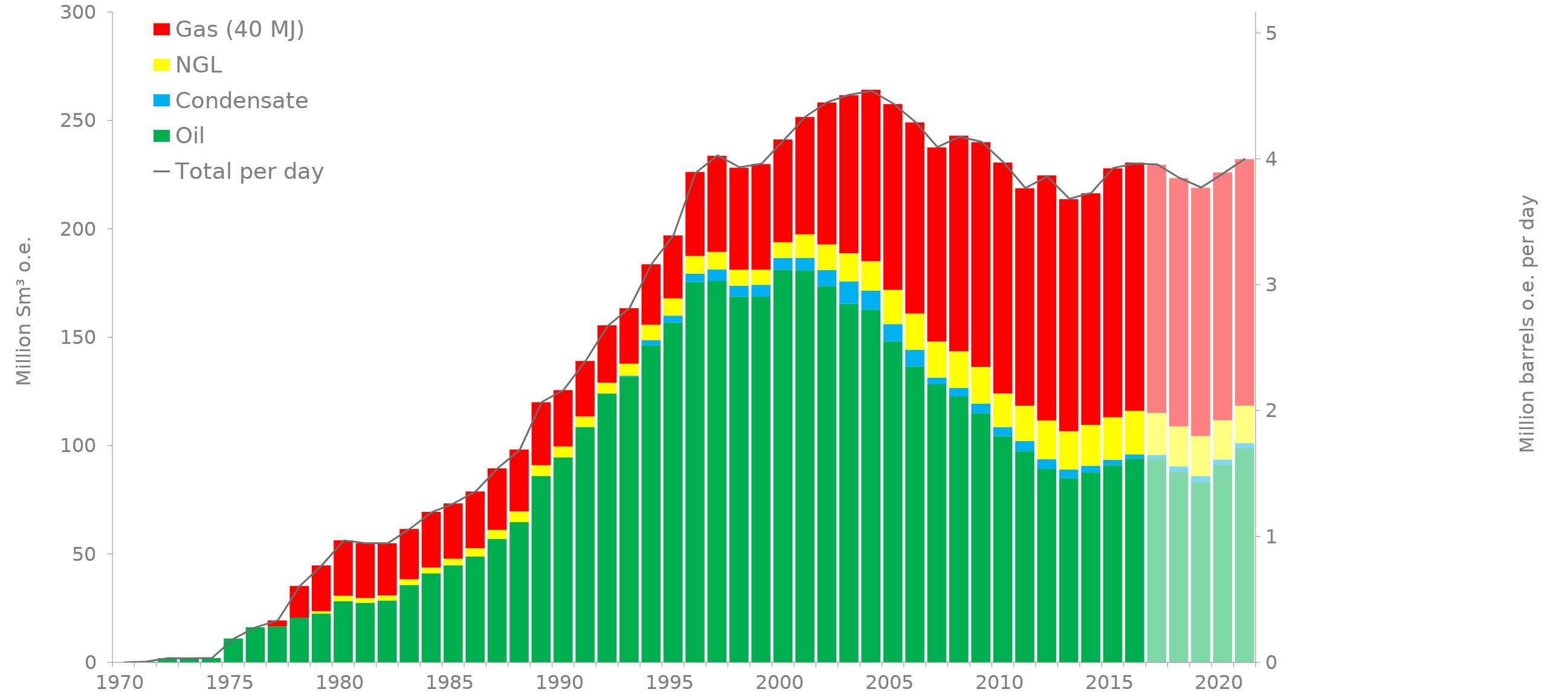
| Category | Oil | Condensate | NGL | Gas (40 MJ) |
|---|---|---|---|---|
| 1970.0 | 0 | 0 | 0 | 0 |
| 1971.0 | 0.36 | 0 | 0 | 0 |
| 1972.0 | 1.93 | 0 | 0 | 0 |
| 1973.0 | 1.87 | 0 | 0 | 0 |
| 1974.0 | 2.01 | 0 | 0 | 0 |
| 1975.0 | 11 | 0 | 0 | 0 |
| 1976.0 | 16.23 | 0 | 0 | 0 |
| 1977.0 | 16.64 | 0 | 0 | 2.72 |
| 1978.0 | 20.64 | 0.02 | 0 | 14.62 |
| 1979.0 | 22.48 | 0.04 | 1.13 | 21.11 |
| 1980.0 | 28.22 | 0.05 | 2.44 | 25.64 |
| 1981.0 | 27.48 | 0.05 | 2.17 | 25.28 |
| 1982.0 | 28.53 | 0.04 | 2.29 | 24.06 |
| 1983.0 | 35.65 | 0.04 | 2.68 | 23.17 |
| 1984.0 | 41.09 | 0.06 | 2.64 | 25.63 |
| 1985.0 | 44.76 | 0.08 | 2.97 | 25.51 |
| 1986.0 | 48.77 | 0.06 | 3.85 | 26.15 |
| 1987.0 | 56.96 | 0.05 | 4.12 | 28.4 |
| 1988.0 | 64.72 | 0.05 | 4.85 | 28.58 |
| 1989.0 | 85.98 | 0.05 | 4.9 | 29.08 |
| 1990.0 | 94.54 | 0.05 | 5.01 | 25.99 |
| 1991.0 | 108.51 | 0.06 | 4.9 | 25.56 |
| 1992.0 | 124 | 0.05 | 4.96 | 26.5 |
| 1993.0 | 131.84 | 0.47 | 5.52 | 25.56 |
| 1994.0 | 146.28 | 2.4 | 7.12 | 27.88 |
| 1995.0 | 156.78 | 3.18 | 7.94 | 29.07 |
| 1996.0 | 175.5 | 3.78 | 8.23 | 38.75 |
| 1997.0 | 175.91 | 5.38 | 8.07 | 44.36 |
| 1998.0 | 168.74 | 5.05 | 7.39 | 47.06 |
| 1999.0 | 168.69 | 5.51 | 6.99 | 48.7 |
| 2000.0 | 181.18 | 5.41 | 7.23 | 47.43 |
| 2001.0 | 180.88 | 5.67 | 10.92 | 54.15 |
| 2002.0 | 173.65 | 7.32 | 11.8 | 65.53 |
| 2003.0 | 165.48 | 10.34 | 12.93 | 72.93 |
| 2004.0 | 162.78 | 8.67 | 13.6 | 79.1 |
| 2005.0 | 148.14 | 7.95 | 15.81 | 85.67 |
| 2006.0 | 136.58 | 7.63 | 16.7 | 88.23 |
| 2007.0 | 128.28 | 3.13 | 16.63 | 89.51 |
| 2008.0 | 122.66 | 3.92 | 16.94 | 99.46 |
| 2009.0 | 114.94 | 4.44 | 16.96 | 103.68 |
| 2010.0 | 104.39 | 4.16 | 15.51 | 106.53 |
| 2011.0 | 97.51 | 4.58 | 16.31 | 100.3 |
| 2012.0 | 89.2 | 4.57 | 17.8 | 113.06 |
| 2013.0 | 84.95 | 3.99 | 17.72 | 107.05 |
| 2014.0 | 87.74 | 2.91 | 18.95 | 106.796 |
| 2015.0 | 90.97 | 2.47 | 19.6 | 114.92 |
| 2016.0 | 94.009 | 1.88 | 20.176 | 114.528 |
| 2017.0 | 93.88 | 1.833 | 19.37 | 114.47 |
| 2018.0 | 88.05 | 2.375 | 18.42 | 114.54 |
| 2019.0 | 83.3 | 2.611 | 18.56 | 114.46 |
| 2020.0 | 91.27 | 2.3 | 18.13 | 114.34 |
| 2021.0 | 98.9 | 2.217 | 17.32 | 113.76 |